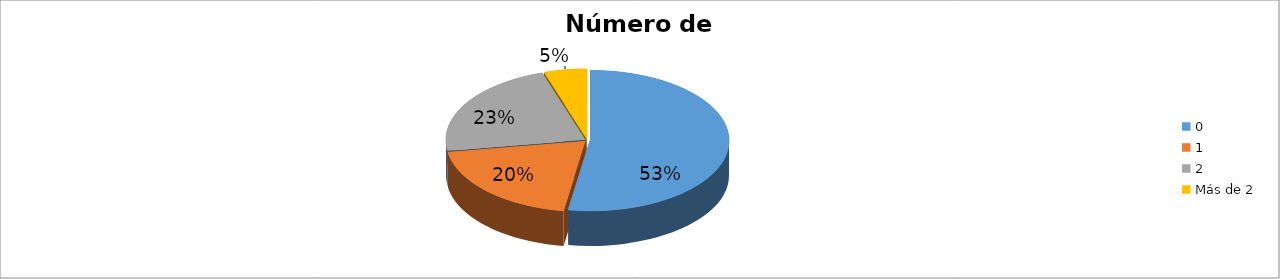
| Category | Series 0 |
|---|---|
| 0 | 0.525 |
| 1 | 0.2 |
| 2 | 0.225 |
| Más de 2 | 0.05 |